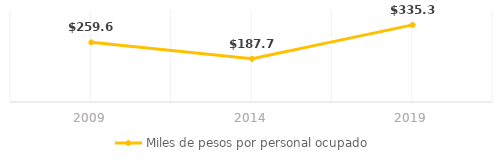
| Category | Miles de pesos por personal ocupado |
|---|---|
| 0 | 259.598 |
| 1 | 187.716 |
| 2 | 335.321 |